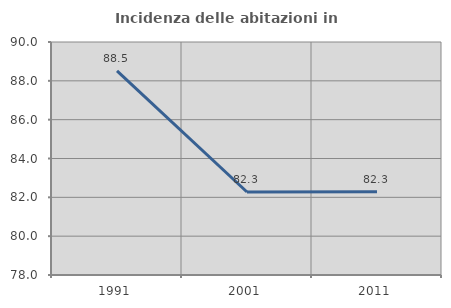
| Category | Incidenza delle abitazioni in proprietà  |
|---|---|
| 1991.0 | 88.515 |
| 2001.0 | 82.273 |
| 2011.0 | 82.282 |